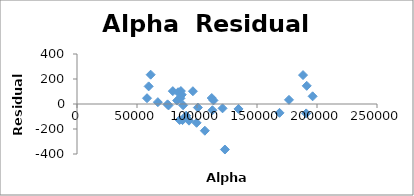
| Category | Series 0 |
|---|---|
| 93335.5 | -133.26 |
| 85534.7 | -127.891 |
| 87948.7 | -128.859 |
| 90970.7 | -93.605 |
| 88400.3 | -10.027 |
| 86242.2 | 45.524 |
| 79857.5 | 102.954 |
| 61388.6 | 234.56 |
| 59704.0 | 140.939 |
| 58356.1 | 46.283 |
| 67380.9 | 14.748 |
| 76250.0 | -11.629 |
| 75493.9 | -2.842 |
| 86570.0 | 103.737 |
| 84231.8 | 94.206 |
| 96598.9 | 102.179 |
| 121289.1 | -34.545 |
| 112854.8 | -49.797 |
| 123265.0 | -364.145 |
| 99658.21 | -150.412 |
| 100713.6 | -28.554 |
| 83452.9 | 27.669 |
| 87284.2 | 74.323 |
| 106531.1 | -213.644 |
| 112286.4 | 47.893 |
| 113725.3 | 28.587 |
| 134572.5 | -39.494 |
| 168771.6 | -70.825 |
| 176649.1 | 33.184 |
| 196354.6 | 61.44 |
| 188372.3 | 231.303 |
| 191449.8 | 145.256 |
| 190964.4 | -75.257 |